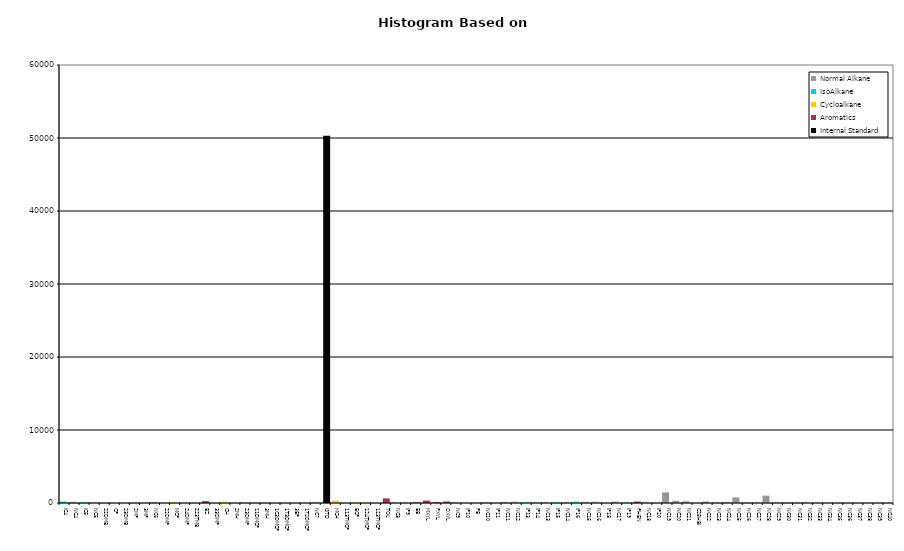
| Category | Normal Alkane | IsoAlkane | Cycloalkane | Aromatics | Internal Standard |
|---|---|---|---|---|---|
| IC4 | 0 | 199 | 0 | 0 | 0 |
| NC4 | 155 | 0 | 0 | 0 | 0 |
| IC5 | 0 | 69 | 0 | 0 | 0 |
| NC5 | 74 | 0 | 0 | 0 | 0 |
| 22DMB | 0 | 0 | 0 | 0 | 0 |
| CP | 0 | 0 | 17 | 0 | 0 |
| 23DMB | 0 | 0 | 0 | 0 | 0 |
| 2MP | 0 | 38 | 0 | 0 | 0 |
| 3MP | 0 | 32 | 0 | 0 | 0 |
| NC6 | 125 | 0 | 0 | 0 | 0 |
| 22DMP | 0 | 0 | 0 | 0 | 0 |
| MCP | 0 | 0 | 88 | 0 | 0 |
| 24DMP | 0 | 0 | 0 | 0 | 0 |
| 223TMB | 0 | 0 | 0 | 0 | 0 |
| BZ | 0 | 0 | 0 | 261 | 0 |
| 33DMP | 0 | 0 | 0 | 0 | 0 |
| CH | 0 | 0 | 174 | 0 | 0 |
| 2MH | 0 | 0 | 0 | 0 | 0 |
| 23DMP | 0 | 51 | 0 | 0 | 0 |
| 11DMCP | 0 | 0 | 0 | 0 | 0 |
| 3MH | 0 | 52 | 0 | 0 | 0 |
| 1C3DMCP | 0 | 0 | 30 | 0 | 0 |
| 1T3DMCP | 0 | 0 | 27 | 0 | 0 |
| 3EP | 0 | 0 | 0 | 0 | 0 |
| 1T2DMCP | 0 | 0 | 34 | 0 | 0 |
| NC7 | 117 | 0 | 0 | 0 | 0 |
| ISTD | 0 | 0 | 0 | 0 | 50296 |
| MCH | 0 | 0 | 311 | 0 | 0 |
| 113TMCP | 0 | 0 | 0 | 0 | 0 |
| ECP | 0 | 0 | 56 | 0 | 0 |
| 124TMCP | 0 | 0 | 55 | 0 | 0 |
| 123TMCP | 0 | 0 | 0 | 0 | 0 |
| TOL | 0 | 0 | 0 | 634 | 0 |
| NC8 | 125 | 0 | 0 | 0 | 0 |
| IP9 | 0 | 44 | 0 | 0 | 0 |
| EB | 0 | 0 | 0 | 82 | 0 |
| MXYL | 0 | 0 | 0 | 333 | 0 |
| PXYL | 0 | 0 | 0 | 123 | 0 |
| OXYL | 0 | 0 | 0 | 208 | 0 |
| NC9 | 129 | 0 | 0 | 0 | 0 |
| IP10 | 0 | 0 | 0 | 0 | 0 |
| PB | 0 | 0 | 0 | 0 | 0 |
| NC10 | 140 | 0 | 0 | 0 | 0 |
| IP11 | 0 | 0 | 0 | 0 | 0 |
| NC11 | 145 | 0 | 0 | 0 | 0 |
| NC12 | 175 | 0 | 0 | 0 | 0 |
| IP13 | 0 | 66 | 0 | 0 | 0 |
| IP14 | 0 | 73 | 0 | 0 | 0 |
| NC13 | 112 | 0 | 0 | 0 | 0 |
| IP15 | 0 | 87 | 0 | 0 | 0 |
| NC14 | 129 | 0 | 0 | 0 | 0 |
| IP16 | 0 | 175 | 0 | 0 | 0 |
| NC15 | 146 | 0 | 0 | 0 | 0 |
| NC16 | 168 | 0 | 0 | 0 | 0 |
| IP18 | 0 | 16 | 0 | 0 | 0 |
| NC17 | 183 | 0 | 0 | 0 | 0 |
| IP19 | 0 | 71 | 0 | 0 | 0 |
| PHEN | 0 | 0 | 0 | 199 | 0 |
| NC18 | 155 | 0 | 0 | 0 | 0 |
| IP20 | 0 | 0 | 0 | 0 | 0 |
| NC19 | 1455 | 0 | 0 | 0 | 0 |
| NC20 | 301 | 0 | 0 | 0 | 0 |
| NC21 | 238 | 0 | 0 | 0 | 0 |
| C25HBI | 0 | 0 | 0 | 0 | 0 |
| NC22 | 204 | 0 | 0 | 0 | 0 |
| NC23 | 96 | 0 | 0 | 0 | 0 |
| NC24 | 118 | 0 | 0 | 0 | 0 |
| NC25 | 770 | 0 | 0 | 0 | 0 |
| NC26 | 72 | 0 | 0 | 0 | 0 |
| NC27 | 75 | 0 | 0 | 0 | 0 |
| NC28 | 1004 | 0 | 0 | 0 | 0 |
| NC29 | 72 | 0 | 0 | 0 | 0 |
| NC30 | 50 | 0 | 0 | 0 | 0 |
| NC31 | 39 | 0 | 0 | 0 | 0 |
| NC32 | 78 | 0 | 0 | 0 | 0 |
| NC33 | 40 | 0 | 0 | 0 | 0 |
| NC34 | 0 | 0 | 0 | 0 | 0 |
| NC35 | 0 | 0 | 0 | 0 | 0 |
| NC36 | 0 | 0 | 0 | 0 | 0 |
| NC37 | 0 | 0 | 0 | 0 | 0 |
| NC38 | 0 | 0 | 0 | 0 | 0 |
| NC39 | 0 | 0 | 0 | 0 | 0 |
| NC40 | 0 | 0 | 0 | 0 | 0 |